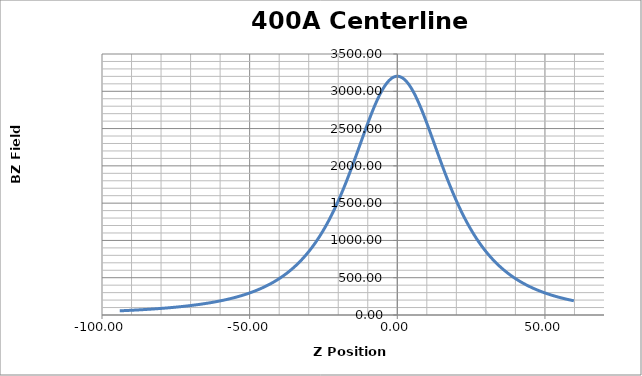
| Category | Series 0 |
|---|---|
| -94.002 | 56.1 |
| -93.801 | 56.44 |
| -93.60300000000001 | 56.81 |
| -93.403 | 57.11 |
| -93.202 | 57.47 |
| -93.002 | 57.8 |
| -92.805 | 58.17 |
| -92.605 | 58.54 |
| -92.404 | 58.89 |
| -92.20400000000001 | 59.27 |
| -92.007 | 59.65 |
| -91.806 | 60 |
| -91.604 | 60.39 |
| -91.403 | 60.75 |
| -91.206 | 61.15 |
| -91.004 | 61.55 |
| -90.803 | 61.93 |
| -90.602 | 62.3 |
| -90.405 | 62.71 |
| -90.205 | 63.1 |
| -90.004 | 63.48 |
| -89.804 | 63.89 |
| -89.607 | 64.28 |
| -89.406 | 64.66 |
| -89.20400000000001 | 65.11 |
| -89.003 | 65.51 |
| -88.806 | 65.94 |
| -88.605 | 66.35 |
| -88.403 | 66.75 |
| -88.203 | 67.22 |
| -88.005 | 67.63 |
| -87.805 | 68.08 |
| -87.60300000000001 | 68.52 |
| -87.404 | 68.94 |
| -87.20700000000001 | 69.39 |
| -87.007 | 69.85 |
| -86.805 | 70.31 |
| -86.60300000000001 | 70.78 |
| -86.406 | 71.21 |
| -86.206 | 71.69 |
| -86.004 | 72.14 |
| -85.803 | 72.64 |
| -85.606 | 73.12 |
| -85.405 | 73.58 |
| -85.203 | 74.07 |
| -85.004 | 74.56 |
| -84.807 | 75.06 |
| -84.607 | 75.55 |
| -84.406 | 76.04 |
| -84.205 | 76.56 |
| -84.006 | 77.09 |
| -83.805 | 77.59 |
| -83.604 | 78.14 |
| -83.403 | 78.62 |
| -83.205 | 79.17 |
| -83.005 | 79.71 |
| -82.804 | 80.22 |
| -82.60300000000001 | 80.79 |
| -82.406 | 81.33 |
| -82.20700000000001 | 81.87 |
| -82.006 | 82.42 |
| -81.805 | 83.01 |
| -81.607 | 83.57 |
| -81.407 | 84.15 |
| -81.205 | 84.68 |
| -81.004 | 85.27 |
| -80.806 | 85.86 |
| -80.606 | 86.45 |
| -80.404 | 87.05 |
| -80.20400000000001 | 87.68 |
| -80.00800000000001 | 88.24 |
| -79.808 | 88.86 |
| -79.607 | 89.48 |
| -79.406 | 90.11 |
| -79.21000000000001 | 90.75 |
| -79.009 | 91.36 |
| -78.806 | 92.01 |
| -78.605 | 92.67 |
| -78.407 | 93.33 |
| -78.20700000000001 | 93.97 |
| -78.005 | 94.63 |
| -77.805 | 95.29 |
| -77.607 | 95.96 |
| -77.408 | 96.61 |
| -77.207 | 97.27 |
| -77.007 | 97.96 |
| -76.809 | 98.7 |
| -76.60900000000001 | 99.37 |
| -76.40700000000001 | 100.1 |
| -76.205 | 100.83 |
| -76.007 | 101.55 |
| -75.808 | 102.26 |
| -75.605 | 103.01 |
| -75.405 | 103.76 |
| -75.207 | 104.52 |
| -75.007 | 105.29 |
| -74.806 | 106.04 |
| -74.606 | 106.83 |
| -74.409 | 107.62 |
| -74.208 | 108.4 |
| -74.006 | 109.23 |
| -73.805 | 110 |
| -73.607 | 110.78 |
| -73.406 | 111.64 |
| -73.205 | 112.41 |
| -73.004 | 113.26 |
| -72.807 | 114.1 |
| -72.608 | 114.9 |
| -72.406 | 115.78 |
| -72.205 | 116.65 |
| -72.00800000000001 | 117.53 |
| -71.808 | 118.37 |
| -71.606 | 119.26 |
| -71.406 | 120.16 |
| -71.207 | 121.13 |
| -71.007 | 122.03 |
| -70.805 | 122.9 |
| -70.605 | 123.88 |
| -70.40700000000001 | 124.8 |
| -70.207 | 125.78 |
| -70.006 | 126.73 |
| -69.805 | 127.71 |
| -69.607 | 128.65 |
| -69.409 | 129.66 |
| -69.207 | 130.66 |
| -69.006 | 131.63 |
| -68.808 | 132.68 |
| -68.607 | 133.66 |
| -68.405 | 134.71 |
| -68.203 | 135.75 |
| -68.006 | 136.78 |
| -67.807 | 137.83 |
| -67.606 | 138.91 |
| -67.404 | 140.06 |
| -67.207 | 141.16 |
| -67.00800000000001 | 142.22 |
| -66.806 | 143.37 |
| -66.606 | 144.47 |
| -66.409 | 145.6 |
| -66.209 | 146.78 |
| -66.006 | 147.97 |
| -65.805 | 149.15 |
| -65.606 | 150.37 |
| -65.40700000000001 | 151.55 |
| -65.206 | 152.78 |
| -65.005 | 153.99 |
| -64.807 | 155.21 |
| -64.60900000000001 | 156.44 |
| -64.40700000000001 | 157.7 |
| -64.207 | 158.98 |
| -64.009 | 160.25 |
| -63.809 | 161.58 |
| -63.606 | 162.92 |
| -63.405 | 164.28 |
| -63.207 | 165.59 |
| -63.008 | 166.96 |
| -62.806 | 168.28 |
| -62.605000000000004 | 169.7 |
| -62.407000000000004 | 171.07 |
| -62.208 | 172.5 |
| -62.007000000000005 | 173.93 |
| -61.807 | 175.34 |
| -61.609 | 176.83 |
| -61.410000000000004 | 178.3 |
| -61.208000000000006 | 179.79 |
| -61.006 | 181.29 |
| -60.807 | 182.81 |
| -60.608000000000004 | 184.36 |
| -60.405 | 185.92 |
| -60.204 | 187.49 |
| -60.007000000000005 | 189.03 |
| -59.809000000000005 | 190.66 |
| -59.608000000000004 | 192.27 |
| -59.407000000000004 | 193.91 |
| -59.21 | 195.55 |
| -59.010000000000005 | 197.22 |
| -58.808 | 198.93 |
| -58.606 | 200.66 |
| -58.407000000000004 | 202.38 |
| -58.208000000000006 | 204.11 |
| -58.007000000000005 | 205.9 |
| -57.806000000000004 | 207.71 |
| -57.607 | 209.52 |
| -57.408 | 211.35 |
| -57.207 | 213.2 |
| -57.006 | 215.11 |
| -56.809000000000005 | 216.93 |
| -56.61 | 218.8 |
| -56.410000000000004 | 220.76 |
| -56.209 | 222.74 |
| -56.010000000000005 | 224.71 |
| -55.81 | 226.67 |
| -55.607 | 228.71 |
| -55.405 | 230.74 |
| -55.206 | 232.83 |
| -55.008 | 234.9 |
| -54.808 | 237.02 |
| -54.607 | 239.13 |
| -54.409 | 241.29 |
| -54.212 | 243.46 |
| -54.010000000000005 | 245.61 |
| -53.808 | 247.88 |
| -53.608000000000004 | 250.16 |
| -53.409 | 252.43 |
| -53.207 | 254.78 |
| -53.005 | 257.12 |
| -52.807 | 259.45 |
| -52.609 | 261.83 |
| -52.407000000000004 | 264.26 |
| -52.206 | 266.74 |
| -52.007000000000005 | 269.22 |
| -51.811 | 271.65 |
| -51.61 | 274.19 |
| -51.409 | 276.75 |
| -51.209 | 279.33 |
| -51.010000000000005 | 281.93 |
| -50.807 | 284.63 |
| -50.606 | 287.34 |
| -50.407000000000004 | 290.02 |
| -50.209 | 292.78 |
| -50.007000000000005 | 295.55 |
| -49.806000000000004 | 298.39 |
| -49.607 | 301.23 |
| -49.409 | 304.09 |
| -49.208000000000006 | 307 |
| -49.007000000000005 | 309.95 |
| -48.809000000000005 | 312.93 |
| -48.611000000000004 | 315.88 |
| -48.409 | 318.98 |
| -48.207 | 322.11 |
| -48.006 | 325.23 |
| -47.808 | 328.36 |
| -47.606 | 331.57 |
| -47.405 | 334.85 |
| -47.207 | 338.09 |
| -47.010000000000005 | 341.4 |
| -46.809000000000005 | 344.72 |
| -46.607 | 348.17 |
| -46.408 | 351.61 |
| -46.21 | 355.07 |
| -46.009 | 358.6 |
| -45.806000000000004 | 362.2 |
| -45.607 | 365.77 |
| -45.409 | 369.43 |
| -45.207 | 373.18 |
| -45.005 | 376.98 |
| -44.805 | 380.76 |
| -44.609 | 384.53 |
| -44.408 | 388.43 |
| -44.207 | 392.43 |
| -44.009 | 396.35 |
| -43.81 | 400.34 |
| -43.608000000000004 | 404.44 |
| -43.407000000000004 | 408.62 |
| -43.207 | 412.83 |
| -43.010000000000005 | 416.99 |
| -42.808 | 421.33 |
| -42.607 | 425.72 |
| -42.406 | 430.12 |
| -42.208000000000006 | 434.54 |
| -42.007000000000005 | 439.07 |
| -41.806000000000004 | 443.66 |
| -41.608000000000004 | 448.26 |
| -41.411 | 452.88 |
| -41.209 | 457.64 |
| -41.007000000000005 | 462.52 |
| -40.807 | 467.4 |
| -40.609 | 472.28 |
| -40.407000000000004 | 477.3 |
| -40.206 | 482.4 |
| -40.006 | 487.5 |
| -39.808 | 492.63 |
| -39.608000000000004 | 497.88 |
| -39.406 | 503.23 |
| -39.207 | 508.62 |
| -39.010000000000005 | 513.98 |
| -38.809000000000005 | 519.53 |
| -38.608000000000004 | 525.18 |
| -38.408 | 530.85 |
| -38.21 | 536.52 |
| -38.007000000000005 | 542.44 |
| -37.805 | 548.38 |
| -37.605000000000004 | 554.33 |
| -37.408 | 560.34 |
| -37.207 | 566.43 |
| -37.006 | 572.68 |
| -36.807 | 578.9 |
| -36.61 | 585.18 |
| -36.408 | 591.72 |
| -36.207 | 598.28 |
| -36.007000000000005 | 604.92 |
| -35.809000000000005 | 611.55 |
| -35.608000000000004 | 618.37 |
| -35.406 | 625.3 |
| -35.206 | 632.27 |
| -35.008 | 639.28 |
| -34.807 | 646.44 |
| -34.605000000000004 | 653.77 |
| -34.406 | 661.13 |
| -34.209 | 668.43 |
| -34.009 | 675.96 |
| -33.807 | 683.67 |
| -33.608000000000004 | 691.43 |
| -33.410000000000004 | 699.15 |
| -33.208000000000006 | 707.19 |
| -33.006 | 715.3 |
| -32.806000000000004 | 723.44 |
| -32.609 | 731.57 |
| -32.408 | 739.96 |
| -32.206 | 748.52 |
| -32.005 | 757.15 |
| -31.808 | 765.74 |
| -31.608000000000004 | 774.58 |
| -31.407000000000004 | 783.55 |
| -31.209000000000003 | 792.55 |
| -31.012 | 801.54 |
| -30.811 | 810.86 |
| -30.608000000000004 | 820.37 |
| -30.408 | 829.89 |
| -30.21 | 839.49 |
| -30.009 | 849.29 |
| -29.807000000000002 | 859.3 |
| -29.607 | 869.3 |
| -29.409999999999997 | 879.33 |
| -29.210000000000008 | 889.6 |
| -29.007999999999996 | 900.12 |
| -28.808000000000007 | 910.65 |
| -28.61 | 921.22 |
| -28.409000000000006 | 932.14 |
| -28.207000000000008 | 943.19 |
| -28.007000000000005 | 954.33 |
| -27.808999999999997 | 965.5 |
| -27.608000000000004 | 976.92 |
| -27.406999999999996 | 988.47 |
| -27.207000000000008 | 1000.18 |
| -27.010999999999996 | 1011.77 |
| -26.810000000000002 | 1023.82 |
| -26.608000000000004 | 1036.01 |
| -26.408 | 1048.29 |
| -26.212000000000003 | 1060.5 |
| -26.010000000000005 | 1073.21 |
| -25.808999999999997 | 1086.03 |
| -25.608000000000004 | 1098.98 |
| -25.409999999999997 | 1111.94 |
| -25.209000000000003 | 1125.16 |
| -25.007999999999996 | 1138.7 |
| -24.807000000000002 | 1152.29 |
| -24.60900000000001 | 1165.81 |
| -24.409000000000006 | 1179.74 |
| -24.207000000000008 | 1193.87 |
| -24.007000000000005 | 1208.06 |
| -23.810000000000002 | 1222.23 |
| -23.61 | 1236.8 |
| -23.409000000000006 | 1251.63 |
| -23.208 | 1266.56 |
| -23.010999999999996 | 1281.43 |
| -22.810000000000002 | 1296.76 |
| -22.607 | 1312.33 |
| -22.406999999999996 | 1327.92 |
| -22.209000000000003 | 1343.48 |
| -22.009 | 1359.47 |
| -21.807000000000002 | 1375.75 |
| -21.60600000000001 | 1392.09 |
| -21.409999999999997 | 1408.26 |
| -21.210000000000008 | 1424.94 |
| -21.009 | 1441.84 |
| -20.808999999999997 | 1458.83 |
| -20.611000000000004 | 1475.84 |
| -20.409999999999997 | 1493.3 |
| -20.208 | 1511.03 |
| -20.007999999999996 | 1528.71 |
| -19.810000000000002 | 1546.4 |
| -19.60900000000001 | 1564.53 |
| -19.406999999999996 | 1582.9 |
| -19.207000000000008 | 1601.33 |
| -19.009 | 1619.68 |
| -18.808999999999997 | 1638.36 |
| -18.608000000000004 | 1657.39 |
| -18.408 | 1676.43 |
| -18.210000000000008 | 1695.49 |
| -18.009 | 1714.93 |
| -17.807000000000002 | 1734.69 |
| -17.607 | 1754.42 |
| -17.409000000000006 | 1774.07 |
| -17.209000000000003 | 1794.04 |
| -17.007000000000005 | 1814.46 |
| -16.805999999999997 | 1834.78 |
| -16.60900000000001 | 1854.97 |
| -16.409000000000006 | 1875.57 |
| -16.208 | 1896.39 |
| -16.007000000000005 | 1917.3 |
| -15.810000000000002 | 1937.97 |
| -15.61 | 1959.08 |
| -15.406999999999996 | 1980.51 |
| -15.206000000000003 | 2001.95 |
| -15.009 | 2023.04 |
| -14.808999999999997 | 2044.56 |
| -14.607 | 2066.32 |
| -14.406000000000006 | 2088.1 |
| -14.209000000000003 | 2109.63 |
| -14.009 | 2131.48 |
| -13.807000000000002 | 2153.54 |
| -13.607 | 2175.52 |
| -13.409999999999997 | 2197.19 |
| -13.209000000000003 | 2219.23 |
| -13.007000000000005 | 2241.55 |
| -12.805999999999997 | 2263.71 |
| -12.609000000000009 | 2285.54 |
| -12.409000000000006 | 2307.63 |
| -12.207000000000008 | 2329.84 |
| -12.007000000000005 | 2351.97 |
| -11.808999999999997 | 2373.82 |
| -11.608000000000004 | 2395.85 |
| -11.406999999999996 | 2418.04 |
| -11.206000000000003 | 2439.92 |
| -11.009 | 2461.47 |
| -10.808999999999997 | 2483.21 |
| -10.607 | 2504.99 |
| -10.406000000000006 | 2526.63 |
| -10.207999999999998 | 2547.91 |
| -10.007999999999996 | 2569.23 |
| -9.807000000000002 | 2590.46 |
| -9.606000000000009 | 2611.59 |
| -9.408000000000001 | 2632.17 |
| -9.207999999999998 | 2652.76 |
| -9.007000000000005 | 2673.4 |
| -8.805999999999997 | 2693.73 |
| -8.609000000000009 | 2713.49 |
| -8.409000000000006 | 2733.27 |
| -8.207000000000008 | 2752.97 |
| -8.006 | 2772.41 |
| -7.808000000000007 | 2791.26 |
| -7.608000000000004 | 2810.04 |
| -7.406000000000006 | 2828.6 |
| -7.206000000000003 | 2846.79 |
| -7.007999999999996 | 2864.38 |
| -6.8089999999999975 | 2881.86 |
| -6.606999999999999 | 2899.11 |
| -6.406000000000006 | 2916.09 |
| -6.209000000000003 | 2932.27 |
| -6.009 | 2948.27 |
| -5.808000000000007 | 2963.96 |
| -5.606999999999999 | 2979.28 |
| -5.409000000000006 | 2993.88 |
| -5.209000000000003 | 3008.27 |
| -5.007000000000005 | 3022.3 |
| -4.805999999999997 | 3035.81 |
| -4.608000000000004 | 3048.67 |
| -4.408000000000001 | 3061.24 |
| -4.206000000000003 | 3073.39 |
| -4.006 | 3084.95 |
| -3.8089999999999975 | 3095.82 |
| -3.609000000000009 | 3106.37 |
| -3.4080000000000013 | 3116.46 |
| -3.207000000000008 | 3125.99 |
| -3.0090000000000003 | 3134.88 |
| -2.8089999999999975 | 3143.3 |
| -2.6069999999999993 | 3151.25 |
| -2.406000000000006 | 3158.56 |
| -2.2079999999999984 | 3165.27 |
| -2.0090000000000003 | 3171.47 |
| -1.8070000000000022 | 3177.15 |
| -1.6060000000000088 | 3182.21 |
| -1.4080000000000013 | 3186.63 |
| -1.2090000000000032 | 3190.48 |
| -1.0079999999999956 | 3193.8 |
| -0.8070000000000022 | 3196.54 |
| -0.6090000000000089 | 3198.65 |
| -0.4099999999999966 | 3200.16 |
| -0.2079999999999984 | 3201.14 |
| -0.006000000000000227 | 3201.49 |
| 0.19199999999999307 | 3201.28 |
| 0.39099999999999113 | 3200.42 |
| 0.5930000000000035 | 3198.93 |
| 0.7939999999999969 | 3196.91 |
| 0.9920000000000044 | 3194.31 |
| 1.1899999999999977 | 3191.09 |
| 1.391999999999996 | 3187.29 |
| 1.5919999999999987 | 3182.92 |
| 1.789999999999992 | 3178.03 |
| 1.9899999999999949 | 3172.51 |
| 2.191999999999993 | 3166.34 |
| 2.3930000000000007 | 3159.66 |
| 2.590999999999994 | 3152.5 |
| 2.790999999999997 | 3144.75 |
| 2.9920000000000044 | 3136.37 |
| 3.1940000000000026 | 3127.44 |
| 3.391999999999996 | 3118.13 |
| 3.590999999999994 | 3108.26 |
| 3.7920000000000016 | 3097.71 |
| 3.992999999999995 | 3086.76 |
| 4.1910000000000025 | 3075.41 |
| 4.390000000000001 | 3063.51 |
| 4.591999999999999 | 3050.94 |
| 4.792999999999992 | 3038 |
| 4.992000000000004 | 3024.7 |
| 5.189999999999998 | 3010.98 |
| 5.391999999999996 | 2996.53 |
| 5.5930000000000035 | 2981.79 |
| 5.790999999999997 | 2966.76 |
| 5.989999999999995 | 2951.3 |
| 6.191999999999993 | 2935.22 |
| 6.393000000000001 | 2918.82 |
| 6.590999999999994 | 2902.26 |
| 6.789999999999992 | 2885.29 |
| 6.992000000000004 | 2867.77 |
| 7.192999999999998 | 2849.9 |
| 7.390999999999991 | 2832.02 |
| 7.590999999999994 | 2813.64 |
| 7.792000000000002 | 2794.81 |
| 7.992999999999995 | 2775.75 |
| 8.191000000000003 | 2756.7 |
| 8.39 | 2737.25 |
| 8.591999999999999 | 2717.37 |
| 8.792999999999992 | 2697.2 |
| 8.992000000000004 | 2677.13 |
| 9.189999999999998 | 2656.84 |
| 9.391999999999996 | 2636.11 |
| 9.593000000000004 | 2615.17 |
| 9.790999999999997 | 2594.35 |
| 9.989999999999995 | 2573.29 |
| 10.191999999999993 | 2551.83 |
| 10.393 | 2530.36 |
| 10.591999999999999 | 2508.97 |
| 10.789999999999992 | 2487.48 |
| 10.992000000000004 | 2465.59 |
| 11.192999999999998 | 2443.64 |
| 11.390999999999991 | 2421.99 |
| 11.590000000000003 | 2400.15 |
| 11.792000000000002 | 2377.98 |
| 11.992000000000004 | 2355.92 |
| 12.191000000000003 | 2334.07 |
| 12.39 | 2312.09 |
| 12.591999999999999 | 2289.79 |
| 12.793999999999997 | 2267.53 |
| 12.991 | 2245.71 |
| 13.189999999999998 | 2223.74 |
| 13.391999999999996 | 2201.6 |
| 13.593000000000004 | 2179.46 |
| 13.790999999999997 | 2157.72 |
| 13.991 | 2135.93 |
| 14.191999999999993 | 2114.08 |
| 14.391999999999996 | 2092.26 |
| 14.590999999999994 | 2070.69 |
| 14.789000000000001 | 2049.27 |
| 14.992000000000004 | 2027.56 |
| 15.192999999999998 | 2005.97 |
| 15.393 | 1984.75 |
| 15.590000000000003 | 1963.79 |
| 15.792000000000002 | 1942.59 |
| 15.992999999999995 | 1921.51 |
| 16.191999999999993 | 1900.77 |
| 16.39 | 1880.27 |
| 16.590999999999994 | 1859.55 |
| 16.792999999999992 | 1838.99 |
| 16.992000000000004 | 1818.8 |
| 17.188999999999993 | 1798.88 |
| 17.39099999999999 | 1778.72 |
| 17.593000000000004 | 1758.65 |
| 17.792 | 1738.98 |
| 17.989999999999995 | 1719.59 |
| 18.191999999999993 | 1700.13 |
| 18.393 | 1680.78 |
| 18.590000000000003 | 1661.79 |
| 18.789 | 1643.1 |
| 18.991 | 1624.16 |
| 19.191999999999993 | 1605.48 |
| 19.39099999999999 | 1587.18 |
| 19.589 | 1569.14 |
| 19.789999999999992 | 1550.99 |
| 19.991 | 1532.99 |
| 20.191000000000003 | 1515.28 |
| 20.388999999999996 | 1497.93 |
| 20.590000000000003 | 1480.47 |
| 20.790999999999997 | 1463.21 |
| 20.991 | 1446.26 |
| 21.188000000000002 | 1429.6 |
| 21.39 | 1412.82 |
| 21.590999999999994 | 1396.23 |
| 21.789999999999992 | 1380.02 |
| 21.988 | 1364.11 |
| 22.188999999999993 | 1348.01 |
| 22.39099999999999 | 1332.08 |
| 22.590999999999994 | 1316.5 |
| 22.787999999999997 | 1301.25 |
| 22.989999999999995 | 1285.87 |
| 23.191000000000003 | 1270.7 |
| 23.39 | 1255.84 |
| 23.587999999999994 | 1241.2 |
| 23.789999999999992 | 1226.53 |
| 23.991 | 1212.02 |
| 24.191000000000003 | 1197.8 |
| 24.38799999999999 | 1183.89 |
| 24.589 | 1169.97 |
| 24.789999999999992 | 1156.1 |
| 24.989999999999995 | 1142.53 |
| 25.188000000000002 | 1129.26 |
| 25.39 | 1115.89 |
| 25.590999999999994 | 1102.69 |
| 25.790999999999997 | 1089.76 |
| 25.989000000000004 | 1077.14 |
| 26.189999999999998 | 1064.43 |
| 26.39099999999999 | 1051.91 |
| 26.590999999999994 | 1039.57 |
| 26.789 | 1027.53 |
| 26.989999999999995 | 1015.46 |
| 27.191000000000003 | 1003.53 |
| 27.39 | 991.84 |
| 27.589 | 980.37 |
| 27.789999999999992 | 968.84 |
| 27.991 | 957.53 |
| 28.191000000000003 | 946.38 |
| 28.388999999999996 | 935.49 |
| 28.590000000000003 | 924.58 |
| 28.792 | 913.81 |
| 28.991 | 903.19 |
| 29.188999999999993 | 892.84 |
| 29.39099999999999 | 882.4 |
| 29.592 | 872.17 |
| 29.790999999999997 | 862.16 |
| 29.989999999999995 | 852.31 |
| 30.189999999999998 | 842.49 |
| 30.39099999999999 | 832.73 |
| 30.590999999999994 | 823.2 |
| 30.789 | 813.85 |
| 30.989999999999995 | 804.45 |
| 31.191999999999993 | 795.21 |
| 31.39099999999999 | 786.19 |
| 31.589 | 777.31 |
| 31.790999999999997 | 768.37 |
| 31.992999999999995 | 759.58 |
| 32.193 | 750.97 |
| 32.39 | 742.55 |
| 32.590999999999994 | 734.13 |
| 32.79299999999999 | 725.79 |
| 32.992999999999995 | 717.6 |
| 33.19 | 709.61 |
| 33.39099999999999 | 701.63 |
| 33.592 | 693.69 |
| 33.792 | 685.95 |
| 33.99000000000001 | 678.36 |
| 34.191 | 670.74 |
| 34.393 | 663.19 |
| 34.59299999999999 | 655.77 |
| 34.791 | 648.59 |
| 34.990999999999985 | 641.43 |
| 35.19399999999999 | 634.26 |
| 35.394000000000005 | 627.29 |
| 35.59 | 620.42 |
| 35.791 | 613.6 |
| 35.99199999999999 | 606.84 |
| 36.19200000000001 | 600.18 |
| 36.389999999999986 | 593.7 |
| 36.59100000000001 | 587.17 |
| 36.793000000000006 | 580.71 |
| 36.992999999999995 | 574.43 |
| 37.191 | 568.22 |
| 37.391999999999996 | 562.06 |
| 37.593999999999994 | 555.94 |
| 37.793000000000006 | 549.95 |
| 37.990999999999985 | 544.15 |
| 38.19200000000001 | 538.25 |
| 38.393 | 532.43 |
| 38.59299999999999 | 526.76 |
| 38.78999999999999 | 521.17 |
| 38.99199999999999 | 515.62 |
| 39.19399999999999 | 510.07 |
| 39.394000000000005 | 504.62 |
| 39.59100000000001 | 499.38 |
| 39.792 | 494.09 |
| 39.992999999999995 | 488.82 |
| 40.192999999999984 | 483.72 |
| 40.391999999999996 | 478.64 |
| 40.591999999999985 | 473.61 |
| 40.793000000000006 | 468.59 |
| 40.992999999999995 | 463.74 |
| 41.191 | 458.96 |
| 41.391999999999996 | 454.16 |
| 41.593999999999994 | 449.4 |
| 41.79400000000001 | 444.74 |
| 41.99199999999999 | 440.19 |
| 42.192999999999984 | 435.67 |
| 42.394000000000005 | 431.16 |
| 42.593999999999994 | 426.72 |
| 42.791 | 422.4 |
| 42.99199999999999 | 418.09 |
| 43.192999999999984 | 413.78 |
| 43.394000000000005 | 409.59 |
| 43.59100000000001 | 405.45 |
| 43.791 | 401.3 |
| 43.99199999999999 | 397.23 |
| 44.192999999999984 | 393.23 |
| 44.389999999999986 | 389.32 |
| 44.59100000000001 | 385.39 |
| 44.793000000000006 | 381.5 |
| 44.992999999999995 | 377.7 |
| 45.19 | 374 |
| 45.391999999999996 | 370.23 |
| 45.59299999999999 | 366.58 |
| 45.792 | 362.91 |
| 45.99000000000001 | 359.38 |
| 46.19 | 355.81 |
| 46.391999999999996 | 352.29 |
| 46.59299999999999 | 348.77 |
| 46.78999999999999 | 345.44 |
| 46.990999999999985 | 342.05 |
| 47.192999999999984 | 338.69 |
| 47.393 | 335.39 |
| 47.59 | 332.16 |
| 47.791 | 328.96 |
| 47.992999999999995 | 325.77 |
| 48.192999999999984 | 322.63 |
| 48.39099999999999 | 319.55 |
| 48.59100000000001 | 316.48 |
| 48.793000000000006 | 313.42 |
| 48.992999999999995 | 310.41 |
| 49.19 | 307.51 |
| 49.39099999999999 | 304.59 |
| 49.59299999999999 | 301.67 |
| 49.79400000000001 | 298.78 |
| 49.990999999999985 | 296.01 |
| 50.19200000000001 | 293.21 |
| 50.393 | 290.41 |
| 50.59299999999999 | 287.71 |
| 50.78999999999999 | 285.01 |
| 50.990999999999985 | 282.37 |
| 51.192999999999984 | 279.71 |
| 51.393 | 277.17 |
| 51.59100000000001 | 274.58 |
| 51.791 | 272 |
| 51.992999999999995 | 269.5 |
| 52.19399999999999 | 267.04 |
| 52.39099999999999 | 264.57 |
| 52.59100000000001 | 262.16 |
| 52.793000000000006 | 259.73 |
| 52.994 | 257.36 |
| 53.191 | 255.06 |
| 53.39099999999999 | 252.74 |
| 53.59299999999999 | 250.41 |
| 53.793000000000006 | 248.16 |
| 53.990999999999985 | 245.91 |
| 54.191 | 243.72 |
| 54.393 | 241.54 |
| 54.593999999999994 | 239.36 |
| 54.792 | 237.23 |
| 54.99199999999999 | 235.09 |
| 55.192999999999984 | 233.02 |
| 55.394000000000005 | 230.93 |
| 55.59100000000001 | 228.9 |
| 55.791 | 226.9 |
| 55.992999999999995 | 224.88 |
| 56.19399999999999 | 222.89 |
| 56.389999999999986 | 221 |
| 56.59100000000001 | 219.04 |
| 56.793000000000006 | 217.1 |
| 56.994 | 215.17 |
| 57.19200000000001 | 213.35 |
| 57.39099999999999 | 211.52 |
| 57.59299999999999 | 209.64 |
| 57.79400000000001 | 207.83 |
| 57.99199999999999 | 206.08 |
| 58.19200000000001 | 204.29 |
| 58.393 | 202.54 |
| 58.593999999999994 | 200.79 |
| 58.791 | 199.12 |
| 58.990999999999985 | 197.41 |
| 59.192999999999984 | 195.71 |
| 59.394000000000005 | 194.04 |
| 59.591999999999985 | 192.45 |
| 59.791 | 190.83 |
| 59.992999999999995 | 189.16 |